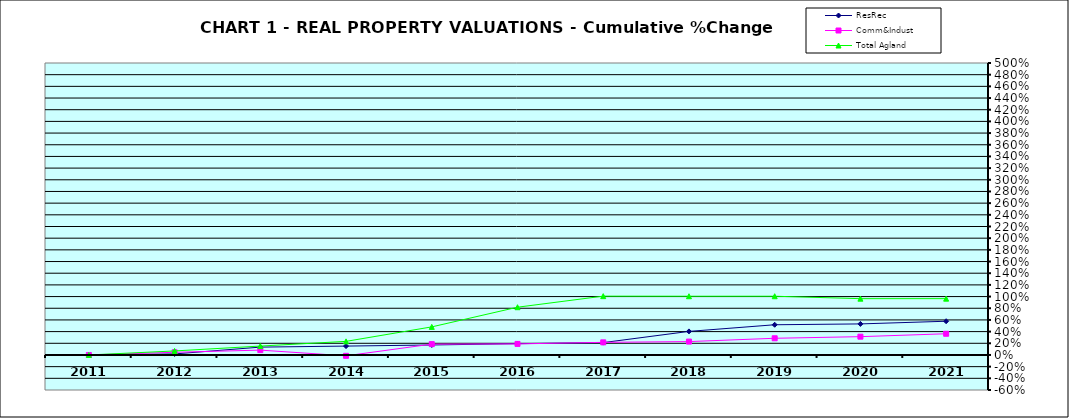
| Category | ResRec | Comm&Indust | Total Agland |
|---|---|---|---|
| 2011.0 | 0 | 0 | 0 |
| 2012.0 | 0.018 | 0.046 | 0.069 |
| 2013.0 | 0.134 | 0.083 | 0.152 |
| 2014.0 | 0.152 | -0.015 | 0.233 |
| 2015.0 | 0.171 | 0.186 | 0.481 |
| 2016.0 | 0.193 | 0.19 | 0.818 |
| 2017.0 | 0.212 | 0.216 | 1.007 |
| 2018.0 | 0.404 | 0.229 | 1.006 |
| 2019.0 | 0.517 | 0.286 | 1.006 |
| 2020.0 | 0.532 | 0.313 | 0.964 |
| 2021.0 | 0.577 | 0.363 | 0.965 |